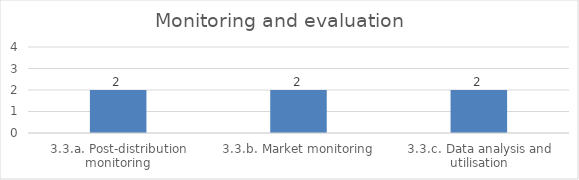
| Category | Monitoring and evaluation |
|---|---|
| 3.3.a. Post-distribution monitoring | 2 |
| 3.3.b. Market monitoring | 2 |
| 3.3.c. Data analysis and utilisation | 2 |